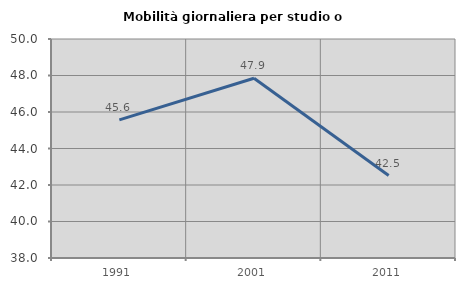
| Category | Mobilità giornaliera per studio o lavoro |
|---|---|
| 1991.0 | 45.568 |
| 2001.0 | 47.851 |
| 2011.0 | 42.518 |